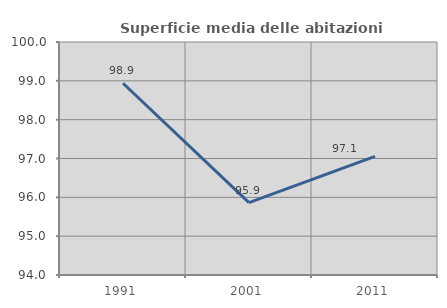
| Category | Superficie media delle abitazioni occupate |
|---|---|
| 1991.0 | 98.938 |
| 2001.0 | 95.863 |
| 2011.0 | 97.056 |